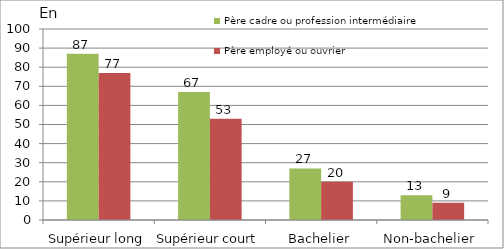
| Category | Père cadre ou profession intermédiaire | Père employé ou ouvrier |
|---|---|---|
| Supérieur long | 87 | 77 |
| Supérieur court | 67 | 53 |
| Bachelier | 27 | 20 |
| Non-bachelier | 13 | 9 |